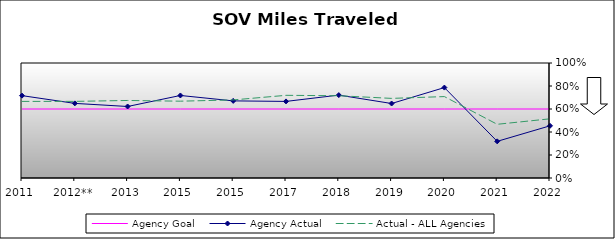
| Category | Agency Goal | Agency Actual | Actual - ALL Agencies |
|---|---|---|---|
| 2011 | 0.6 | 0.716 | 0.666 |
| 2012** | 0.6 | 0.649 | 0.666 |
| 2013 | 0.6 | 0.622 | 0.674 |
| 2015 | 0.6 | 0.718 | 0.668 |
| 2015 | 0.6 | 0.671 | 0.679 |
| 2017 | 0.6 | 0.666 | 0.719 |
| 2018 | 0.6 | 0.721 | 0.715 |
| 2019 | 0.6 | 0.648 | 0.692 |
| 2020 | 0.6 | 0.786 | 0.708 |
| 2021 | 0.6 | 0.319 | 0.467 |
| 2022 | 0.6 | 0.454 | 0.515 |